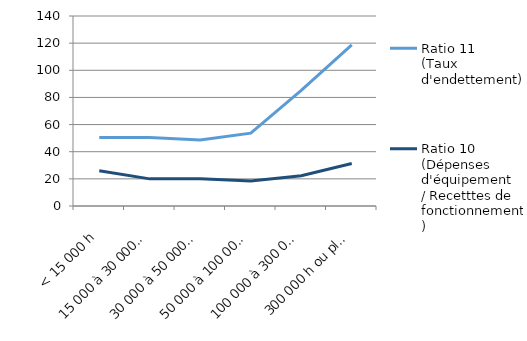
| Category | Ratio 11
(Taux d'endettement) | Ratio 10 
(Dépenses d'équipement
/ Recetttes de fonctionnement) |
|---|---|---|
| < 15 000 h | 50.443 | 26.019 |
| 15 000 à 30 000 h | 50.454 | 19.993 |
| 30 000 à 50 000 h | 48.627 | 20.043 |
| 50 000 à 100 000 h | 53.702 | 18.402 |
| 100 000 à 300 000 h | 85.119 | 22.364 |
| 300 000 h ou plus | 118.794 | 31.367 |